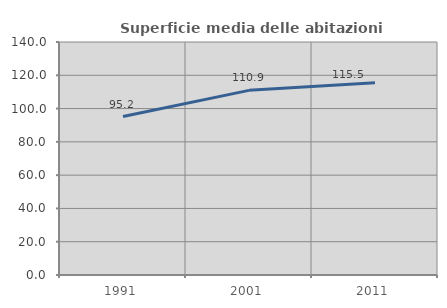
| Category | Superficie media delle abitazioni occupate |
|---|---|
| 1991.0 | 95.22 |
| 2001.0 | 110.944 |
| 2011.0 | 115.537 |